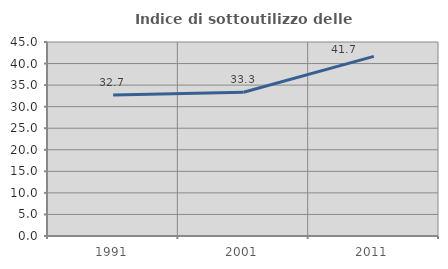
| Category | Indice di sottoutilizzo delle abitazioni  |
|---|---|
| 1991.0 | 32.692 |
| 2001.0 | 33.333 |
| 2011.0 | 41.667 |